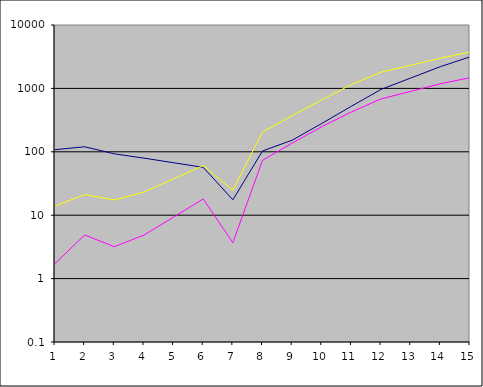
| Category | Series 0 | Series 1 | Series 2 |
|---|---|---|---|
| 0 | 108.046 | 1.728 | 13.868 |
| 1 | 120.03 | 4.878 | 21.176 |
| 2 | 92.858 | 3.18 | 17.395 |
| 3 | 79.442 | 4.854 | 23.073 |
| 4 | 67.229 | 9.349 | 37.437 |
| 5 | 56.894 | 18.004 | 60.742 |
| 6 | 17.494 | 3.686 | 24.747 |
| 7 | 102.975 | 73.301 | 204.749 |
| 8 | 152.476 | 137.237 | 371.611 |
| 9 | 279.827 | 248.694 | 659.553 |
| 10 | 523.805 | 425.57 | 1151.259 |
| 11 | 963.699 | 682.22 | 1803.935 |
| 12 | 1456.579 | 897.992 | 2322.062 |
| 13 | 2201.54 | 1182.007 | 2989.005 |
| 14 | 3142.633 | 1475.58 | 3755.338 |